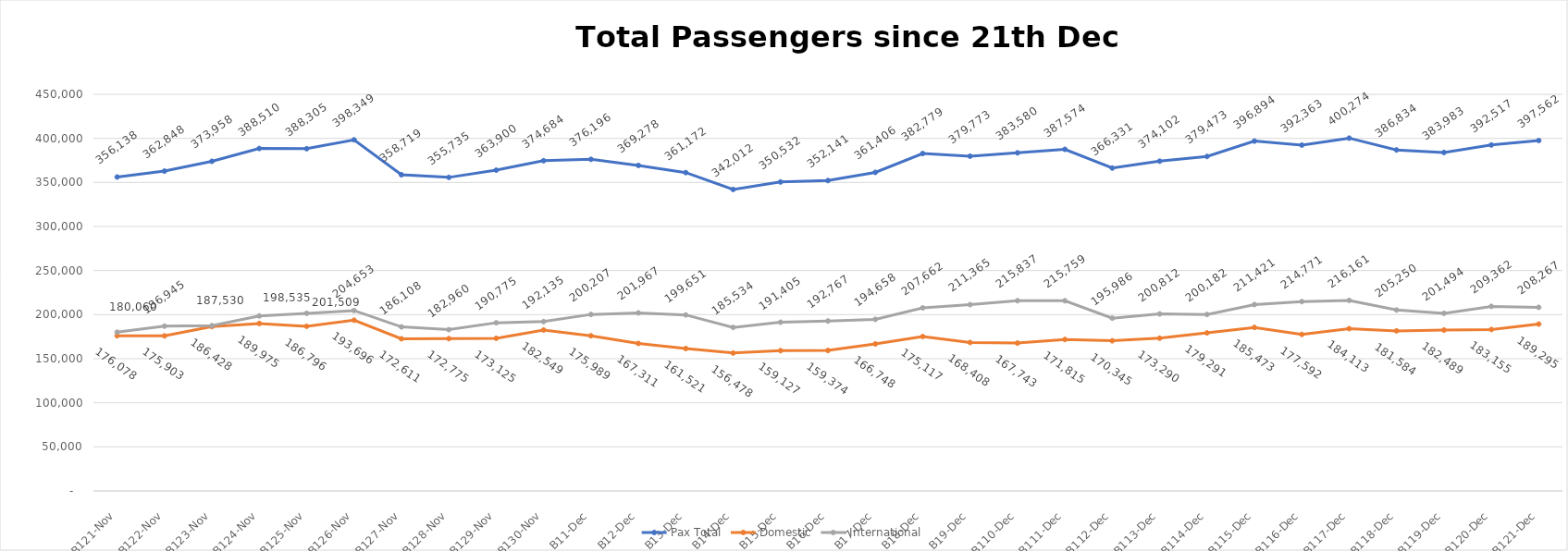
| Category | Pax Total | Domestic | International |
|---|---|---|---|
| 2023-11-21 | 356138 | 176078 | 180060 |
| 2023-11-22 | 362848 | 175903 | 186945 |
| 2023-11-23 | 373958 | 186428 | 187530 |
| 2023-11-24 | 388510 | 189975 | 198535 |
| 2023-11-25 | 388305 | 186796 | 201509 |
| 2023-11-26 | 398349 | 193696 | 204653 |
| 2023-11-27 | 358719 | 172611 | 186108 |
| 2023-11-28 | 355735 | 172775 | 182960 |
| 2023-11-29 | 363900 | 173125 | 190775 |
| 2023-11-30 | 374684 | 182549 | 192135 |
| 2023-12-01 | 376196 | 175989 | 200207 |
| 2023-12-02 | 369278 | 167311 | 201967 |
| 2023-12-03 | 361172 | 161521 | 199651 |
| 2023-12-04 | 342012 | 156478 | 185534 |
| 2023-12-05 | 350532 | 159127 | 191405 |
| 2023-12-06 | 352141 | 159374 | 192767 |
| 2023-12-07 | 361406 | 166748 | 194658 |
| 2023-12-08 | 382779 | 175117 | 207662 |
| 2023-12-09 | 379773 | 168408 | 211365 |
| 2023-12-10 | 383580 | 167743 | 215837 |
| 2023-12-11 | 387574 | 171815 | 215759 |
| 2023-12-12 | 366331 | 170345 | 195986 |
| 2023-12-13 | 374102 | 173290 | 200812 |
| 2023-12-14 | 379473 | 179291 | 200182 |
| 2023-12-15 | 396894 | 185473 | 211421 |
| 2023-12-16 | 392363 | 177592 | 214771 |
| 2023-12-17 | 400274 | 184113 | 216161 |
| 2023-12-18 | 386834 | 181584 | 205250 |
| 2023-12-19 | 383983 | 182489 | 201494 |
| 2023-12-20 | 392517 | 183155 | 209362 |
| 2023-12-21 | 397562 | 189295 | 208267 |